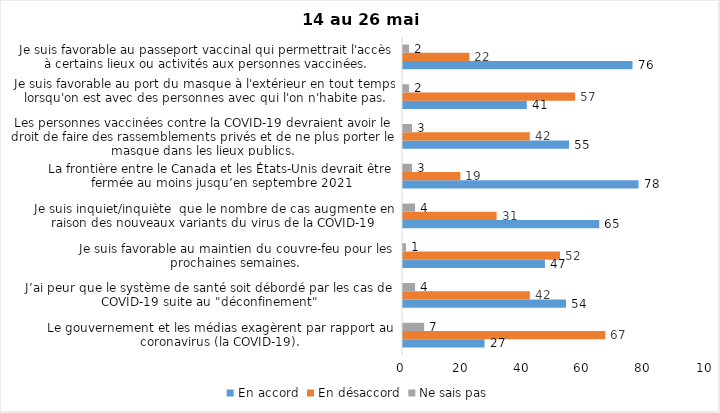
| Category | En accord | En désaccord | Ne sais pas |
|---|---|---|---|
| Le gouvernement et les médias exagèrent par rapport au coronavirus (la COVID-19). | 27 | 67 | 7 |
| J’ai peur que le système de santé soit débordé par les cas de COVID-19 suite au "déconfinement" | 54 | 42 | 4 |
| Je suis favorable au maintien du couvre-feu pour les prochaines semaines. | 47 | 52 | 1 |
| Je suis inquiet/inquiète  que le nombre de cas augmente en raison des nouveaux variants du virus de la COVID-19 | 65 | 31 | 4 |
| La frontière entre le Canada et les États-Unis devrait être fermée au moins jusqu’en septembre 2021 | 78 | 19 | 3 |
| Les personnes vaccinées contre la COVID-19 devraient avoir le droit de faire des rassemblements privés et de ne plus porter le masque dans les lieux publics. | 55 | 42 | 3 |
| Je suis favorable au port du masque à l'extérieur en tout temps lorsqu'on est avec des personnes avec qui l'on n'habite pas. | 41 | 57 | 2 |
| Je suis favorable au passeport vaccinal qui permettrait l'accès à certains lieux ou activités aux personnes vaccinées. | 76 | 22 | 2 |